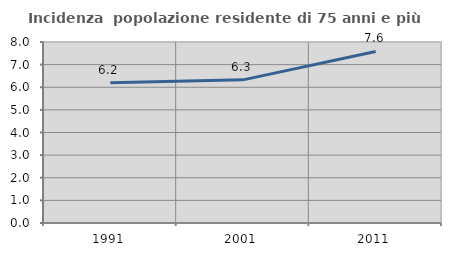
| Category | Incidenza  popolazione residente di 75 anni e più |
|---|---|
| 1991.0 | 6.195 |
| 2001.0 | 6.327 |
| 2011.0 | 7.58 |